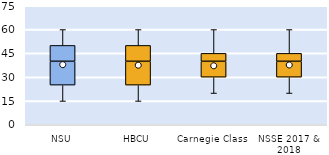
| Category | 25th | 50th | 75th |
|---|---|---|---|
| NSU | 25 | 15 | 10 |
| HBCU | 25 | 15 | 10 |
| Carnegie Class | 30 | 10 | 5 |
| NSSE 2017 & 2018 | 30 | 10 | 5 |